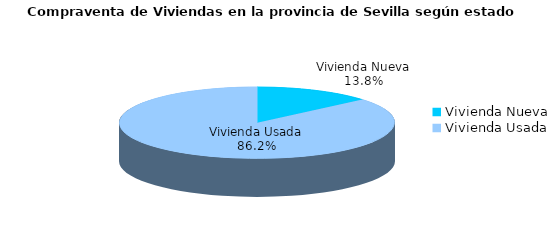
| Category | Series 0 | Series 1 |
|---|---|---|
| Vivienda Nueva | 138 | 0.138 |
| Vivienda Usada | 863 | 0.862 |